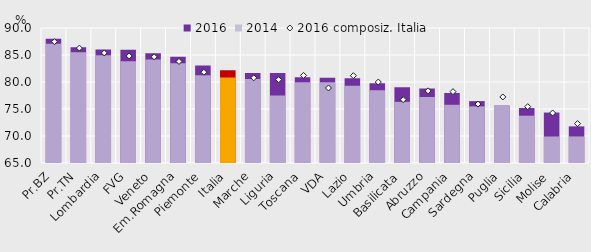
| Category | 2016 | 2014 |
|---|---|---|
| Pr.BZ | 88.03 | 87.07 |
| Pr.TN | 86.43 | 85.51 |
| Lombardia | 86 | 84.95 |
| FVG | 85.95 | 83.84 |
| Veneto | 85.31 | 84.17 |
| Em.Romagna | 84.69 | 83.45 |
| Piemonte | 83.06 | 81.23 |
| Italia | 82.16 | 80.82 |
| Marche | 81.68 | 80.55 |
| Liguria | 81.67 | 77.51 |
| Toscana | 80.87 | 79.94 |
| VDA | 80.77 | 79.95 |
| Lazio | 80.71 | 79.3 |
| Umbria | 79.78 | 78.49 |
| Basilicata | 79.04 | 76.32 |
| Abruzzo | 78.79 | 77.23 |
| Campania | 77.95 | 75.78 |
| Sardegna | 76.46 | 75.48 |
| Puglia | 75.64 | 75.64 |
| Sicilia | 75.17 | 73.76 |
| Molise | 74.34 | 69.91 |
| Calabria | 71.78 | 69.92 |